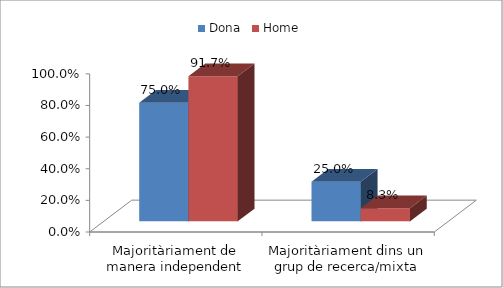
| Category | Dona | Home |
|---|---|---|
| Majoritàriament de manera independent | 0.75 | 0.917 |
| Majoritàriament dins un grup de recerca/mixta | 0.25 | 0.083 |